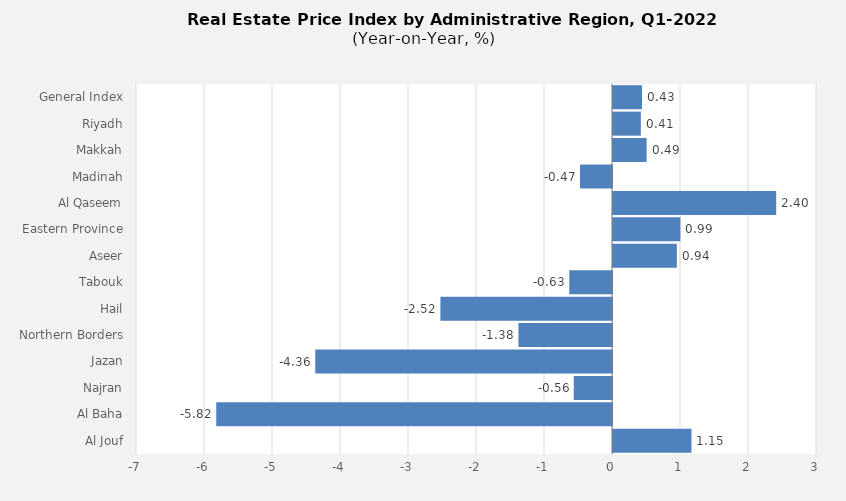
| Category | 2022 |
|---|---|
| General Index | 0.427 |
| Riyadh | 0.41 |
| Makkah | 0.494 |
| Madinah | -0.47 |
| Al Qaseem | 2.4 |
| Eastern Province | 0.991 |
| Aseer | 0.939 |
| Tabouk | -0.628 |
| Hail | -2.523 |
| Northern Borders | -1.376 |
| Jazan | -4.364 |
| Najran | -0.562 |
| Al Baha | -5.82 |
| Al Jouf | 1.154 |